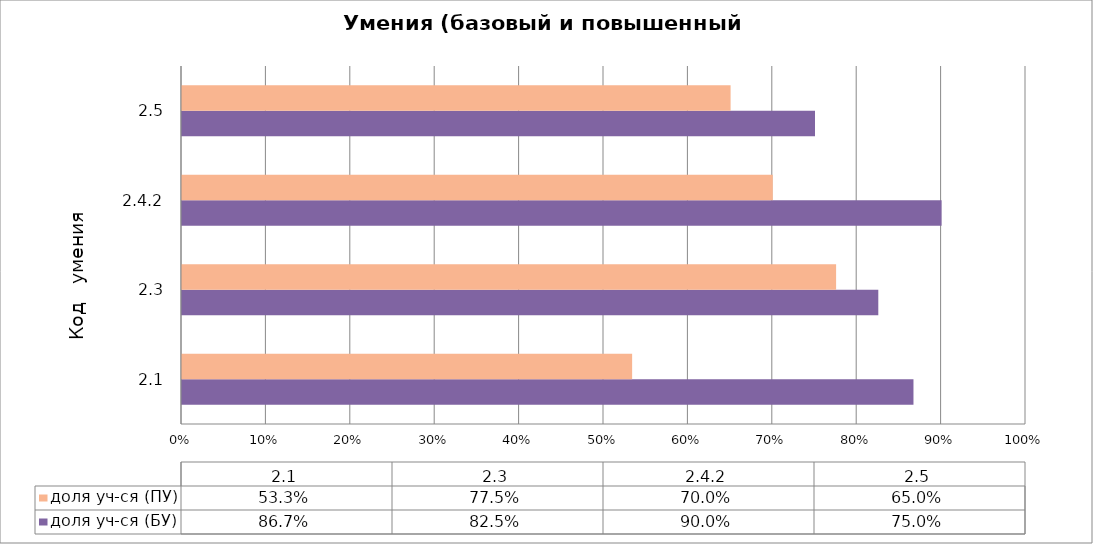
| Category | доля уч-ся (БУ) | доля уч-ся (ПУ) |
|---|---|---|
| 2.1 | 0.867 | 0.533 |
| 2.3 | 0.825 | 0.775 |
| 2.4.2 | 0.9 | 0.7 |
| 2.5 | 0.75 | 0.65 |